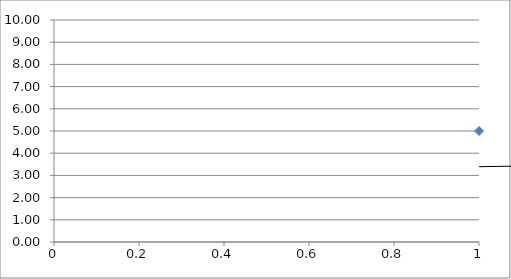
| Category | Series 0 |
|---|---|
| 0 | 5 |
| 1 | 2.5 |
| 2 | 4 |
| 3 | 4 |
| 4 | 4 |
| 5 | 4 |
| 6 | 5.857 |
| 7 | 6 |
| 8 | 5 |
| 9 | 6 |
| 10 | 6 |
| 11 | 7 |
| 12 | 9 |
| 13 | 8 |
| 14 | 8 |
| 15 | 8.438 |
| 16 | 8.875 |
| 17 | 8.444 |
| 18 | 7.143 |